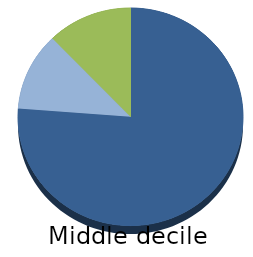
| Category | Series 0 |
|---|---|
| Public transfers | 0.762 |
| Work | 0.116 |
| Capital | 0.122 |